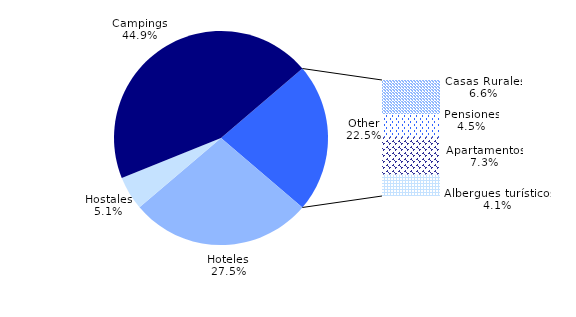
| Category | Número de plazas |
|---|---|
| Hoteles | 4964 |
| Hostales | 924 |
| Campings | 8087 |
| Casas Rurales | 1192 |
| Pensiones | 806 |
| Apartamentos | 1315 |
| Albergues turísticos | 743 |